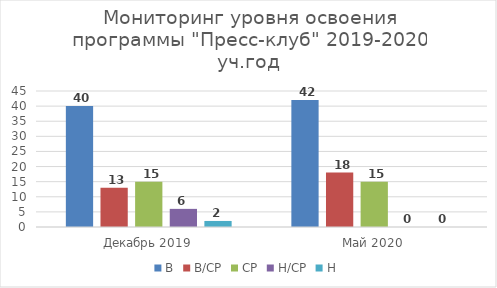
| Category | В | В/СР | СР | Н/СР | Н |
|---|---|---|---|---|---|
| Декабрь 2019 | 40 | 13 | 15 | 6 | 2 |
| Май 2020 | 42 | 18 | 15 | 0 | 0 |